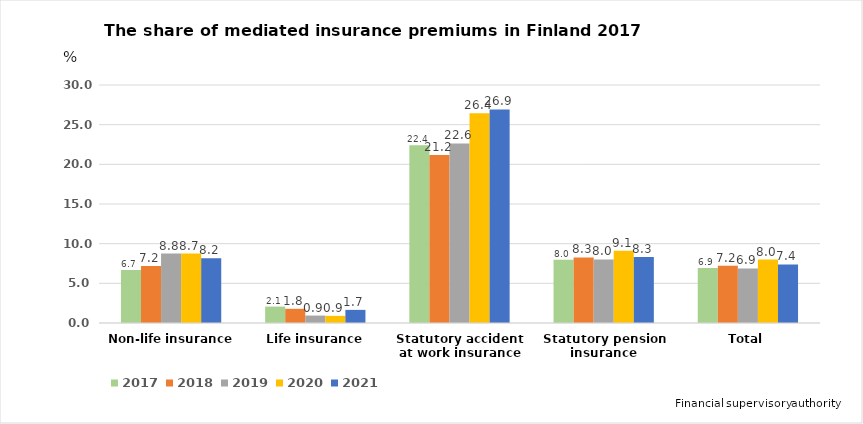
| Category | 2017 | 2018 | 2019 | 2020 | 2021 |
|---|---|---|---|---|---|
| Non-life insurance | 6.681 | 7.184 | 8.751 | 8.75 | 8.151 |
| Life insurance | 2.067 | 1.786 | 0.938 | 0.899 | 1.654 |
| Statutory accident at work insurance | 22.408 | 21.186 | 22.632 | 26.436 | 26.92 |
| Statutory pension insurance | 7.982 | 8.268 | 8.015 | 9.101 | 8.331 |
| Total | 6.948 | 7.208 | 6.878 | 8 | 7.377 |